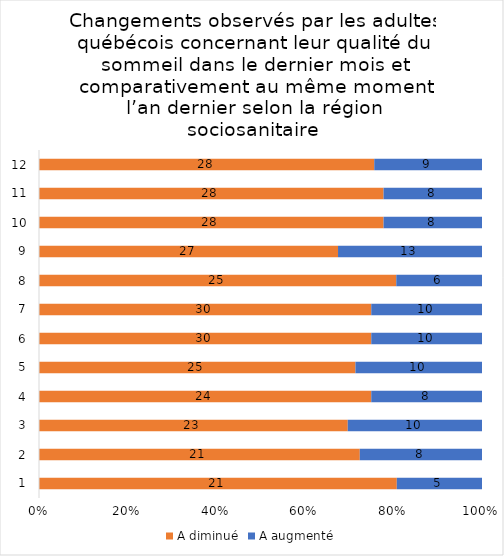
| Category | A diminué | A augmenté |
|---|---|---|
| 0 | 21 | 5 |
| 1 | 21 | 8 |
| 2 | 23 | 10 |
| 3 | 24 | 8 |
| 4 | 25 | 10 |
| 5 | 30 | 10 |
| 6 | 30 | 10 |
| 7 | 25 | 6 |
| 8 | 27 | 13 |
| 9 | 28 | 8 |
| 10 | 28 | 8 |
| 11 | 28 | 9 |